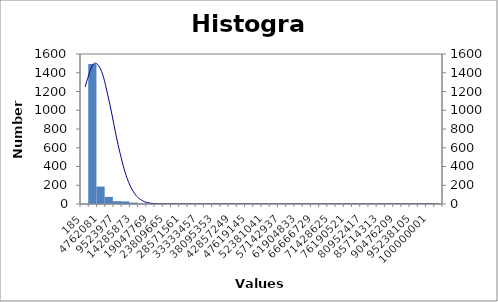
| Category | Series 0 |
|---|---|
| 185.0 | 1 |
| 2381133.0 | 1493 |
| 4762081.0 | 186 |
| 7143029.0 | 76 |
| 9523977.0 | 30 |
| 11904925.0 | 28 |
| 14285873.0 | 15 |
| 16666821.0 | 5 |
| 19047769.0 | 2 |
| 21428717.0 | 3 |
| 23809665.0 | 3 |
| 26190613.0 | 4 |
| 28571561.0 | 1 |
| 30952509.0 | 0 |
| 33333457.0 | 0 |
| 35714405.0 | 1 |
| 38095353.0 | 0 |
| 40476301.0 | 1 |
| 42857249.0 | 0 |
| 45238197.0 | 1 |
| 47619145.0 | 0 |
| 50000093.0 | 0 |
| 52381041.0 | 0 |
| 54761989.0 | 0 |
| 57142937.0 | 0 |
| 59523885.0 | 0 |
| 61904833.0 | 0 |
| 64285781.0 | 0 |
| 66666729.0 | 0 |
| 69047677.0 | 0 |
| 71428625.0 | 0 |
| 73809573.0 | 0 |
| 76190521.0 | 0 |
| 78571469.0 | 0 |
| 80952417.0 | 0 |
| 83333365.0 | 0 |
| 85714313.0 | 0 |
| 88095261.0 | 1 |
| 90476209.0 | 1 |
| 92857157.0 | 0 |
| 95238105.0 | 0 |
| 97619053.0 | 0 |
| 100000001.0 | 1 |
| 102380949.0 | 0 |